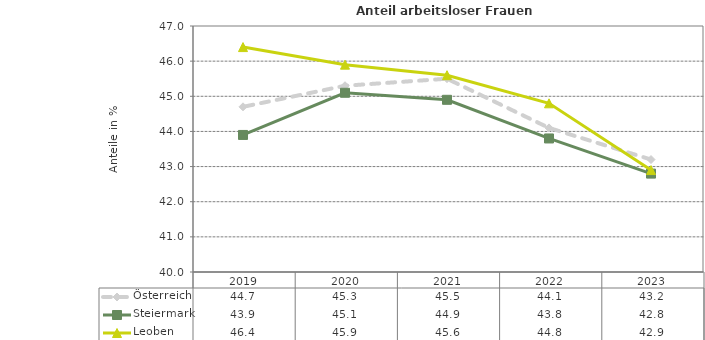
| Category | Österreich | Steiermark | Leoben |
|---|---|---|---|
| 2023.0 | 43.2 | 42.8 | 42.9 |
| 2022.0 | 44.1 | 43.8 | 44.8 |
| 2021.0 | 45.5 | 44.9 | 45.6 |
| 2020.0 | 45.3 | 45.1 | 45.9 |
| 2019.0 | 44.7 | 43.9 | 46.4 |